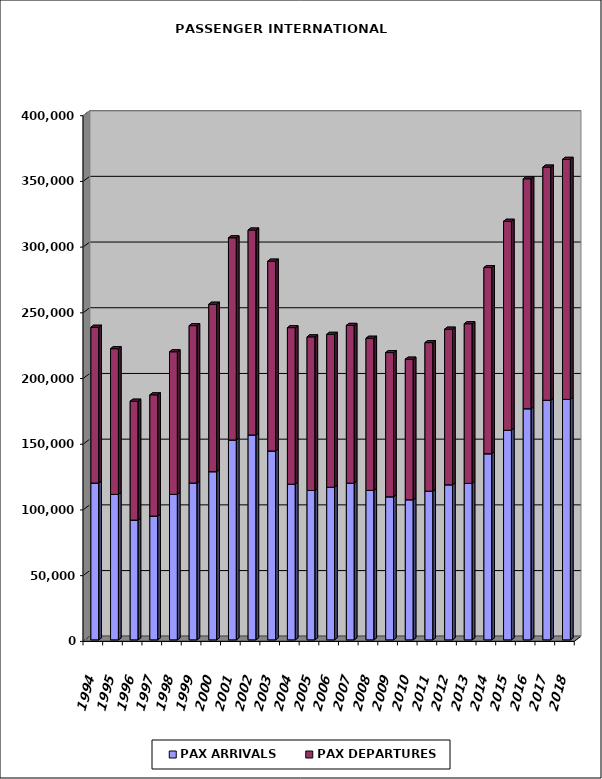
| Category | PAX ARRIVALS | PAX DEPARTURES |
|---|---|---|
| 1994.0 | 119301 | 118568 |
| 1995.0 | 110706 | 110849 |
| 1996.0 | 91119 | 90508 |
| 1997.0 | 94156 | 92276 |
| 1998.0 | 110723 | 108481 |
| 1999.0 | 119351 | 119745 |
| 2000.0 | 127962 | 127432 |
| 2001.0 | 152115 | 153813 |
| 2002.0 | 155897 | 155938 |
| 2003.0 | 143717 | 144456 |
| 2004.0 | 118431 | 119132 |
| 2005.0 | 113659 | 116890 |
| 2006.0 | 116136 | 116357 |
| 2007.0 | 119229 | 120058 |
| 2008.0 | 113740 | 115771 |
| 2009.0 | 108855 | 109746 |
| 2010.0 | 106619 | 106990 |
| 2011.0 | 113125 | 113060 |
| 2012.0 | 117989 | 118451 |
| 2013.0 | 119070 | 121487 |
| 2014.0 | 141609 | 141691 |
| 2015.0 | 159492 | 159031 |
| 2016.0 | 175866 | 174961 |
| 2017.0 | 182344 | 177397 |
| 2018.0 | 183006 | 182648 |